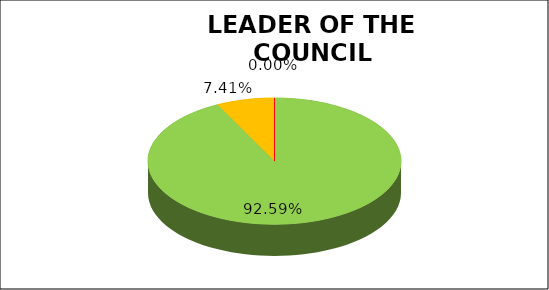
| Category | Series 0 |
|---|---|
| Green | 0.926 |
| Amber | 0.074 |
| Red | 0 |